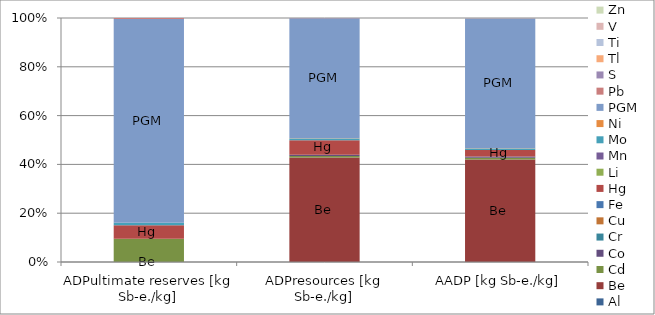
| Category | Al | Be | Cd | Co | Cr | Cu | Fe | Hg | Li | Mn | Mo | Ni | PGM | Pb | S | Tl | Ti | V | Zn |
|---|---|---|---|---|---|---|---|---|---|---|---|---|---|---|---|---|---|---|---|
| ADPultimate reserves [kg Sb-e./kg] | 0 | 0 | 0.157 | 0 | 0 | 0.001 | 0 | 0.092 | 0 | 0 | 0.018 | 0 | 1.396 | 0.006 | 0 | 0 | 0 | 0 | 0.001 |
| ADPresources [kg Sb-e./kg] | 0 | 5.706 | 0.087 | 0.068 | 0 | 0 | 0 | 0.784 | 0.003 | 0.001 | 0.093 | 0.016 | 6.559 | 0 | 0 | 0.003 | 0 | 0.002 | 0 |
| AADP [kg Sb-e./kg] | 0 | 17.216 | 0.272 | 0.227 | 0 | 0.001 | 0 | 1.069 | 0.009 | 0.003 | 0.246 | 0.038 | 21.841 | 0.001 | 0.001 | 0.014 | 0.001 | 0.009 | 0.001 |